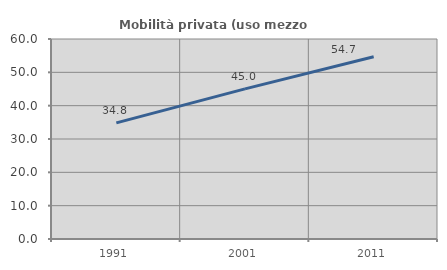
| Category | Mobilità privata (uso mezzo privato) |
|---|---|
| 1991.0 | 34.833 |
| 2001.0 | 45.03 |
| 2011.0 | 54.675 |